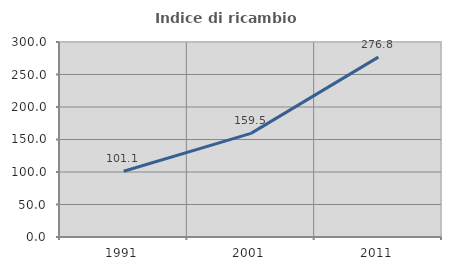
| Category | Indice di ricambio occupazionale  |
|---|---|
| 1991.0 | 101.088 |
| 2001.0 | 159.473 |
| 2011.0 | 276.768 |